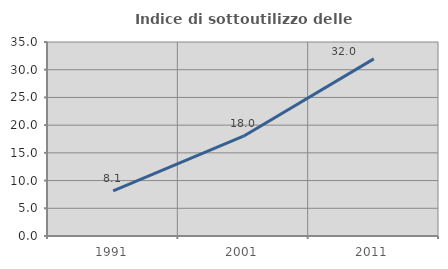
| Category | Indice di sottoutilizzo delle abitazioni  |
|---|---|
| 1991.0 | 8.124 |
| 2001.0 | 17.998 |
| 2011.0 | 31.951 |